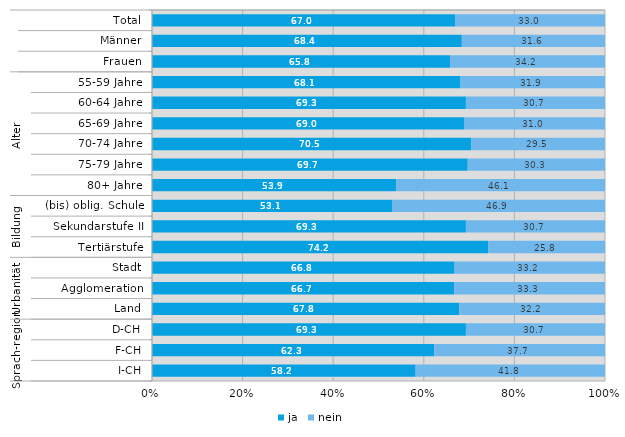
| Category | ja | nein |
|---|---|---|
| 0 | 67 | 33 |
| 1 | 68.4 | 31.6 |
| 2 | 65.8 | 34.2 |
| 3 | 68.1 | 31.9 |
| 4 | 69.3 | 30.7 |
| 5 | 69 | 31 |
| 6 | 70.5 | 29.5 |
| 7 | 69.7 | 30.3 |
| 8 | 53.9 | 46.1 |
| 9 | 53.1 | 46.9 |
| 10 | 69.3 | 30.7 |
| 11 | 74.2 | 25.8 |
| 12 | 66.8 | 33.2 |
| 13 | 66.7 | 33.3 |
| 14 | 67.8 | 32.2 |
| 15 | 69.3 | 30.7 |
| 16 | 62.3 | 37.7 |
| 17 | 58.2 | 41.8 |